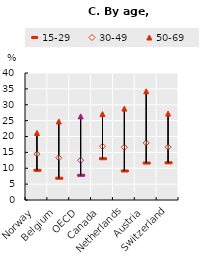
| Category | 15-29 | 30-49 | 50-69 |
|---|---|---|---|
| Norway | 9.351 | 14.493 | 21.114 |
| Belgium | 6.857 | 13.307 | 24.731 |
| OECD | 7.784 | 12.533 | 26.346 |
| Canada | 13 | 16.9 | 27.1 |
| Netherlands | 9.137 | 16.63 | 28.783 |
| Austria | 11.636 | 17.984 | 34.252 |
| Switzerland | 11.709 | 16.632 | 27.225 |